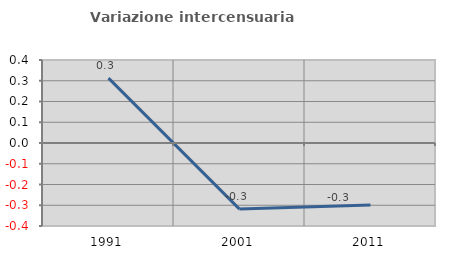
| Category | Variazione intercensuaria annua |
|---|---|
| 1991.0 | 0.312 |
| 2001.0 | -0.318 |
| 2011.0 | -0.298 |